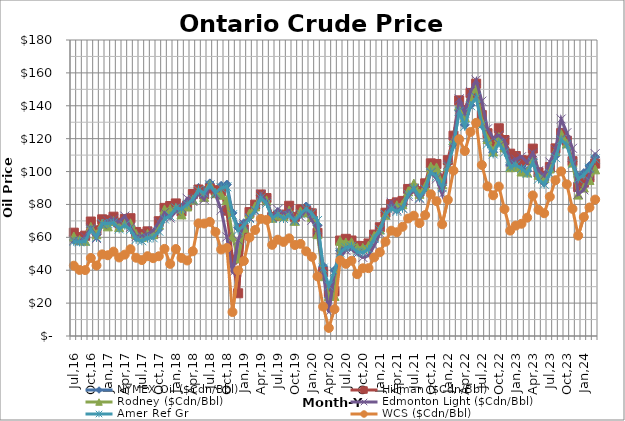
| Category | NYMEX Oil ($Cdn/Bbl) | Hillman ($Cdn/Bbl) | Rodney ($Cdn/Bbl) | Edmonton Light ($Cdn/Bbl) | Amer Ref Gr | WCS ($Cdn/Bbl) |
|---|---|---|---|---|---|---|
| Jul,16 | 58.402 | 62.836 | 60.504 | 58.2 | 57.457 | 42.76 |
| Aug,16 | 58.235 | 60.159 | 58.426 | 57.54 | 57.205 | 40.17 |
| Sep,16 | 59.2 | 61.012 | 57.906 | 60.34 | 57.582 | 40.081 |
| Oct,16 | 66.149 | 69.615 | 66.401 | 65.655 | 64.675 | 47.459 |
| Nov,16 | 61.53 | 64.262 | 61.841 | 59.252 | 59.938 | 42.876 |
| Dec,16 | 69.652 | 70.956 | 68.278 | 67.883 | 68.376 | 49.643 |
| Jan,17 | 69.463 | 70.426 | 66.674 | 70.263 | 68.355 | 49.105 |
| Feb,17 | 70.095 | 72.571 | 69.871 | 71.136 | 68.898 | 51.317 |
| Mar,17 | 66.475 | 68.879 | 66.254 | 69.358 | 65.124 | 47.748 |
| Apr,17 | 68.678 | 71.118 | 68.452 | 72.914 | 67.369 | 49.496 |
| May,17 | 65.993 | 71.625 | 68.537 | 66.034 | 64.689 | 52.805 |
| Jun,17 | 60.076 | 63.267 | 62.036 | 60.492 | 58.788 | 47.587 |
| Jul,17 | 59.257 | 62.109 | 60.273 | 60.781 | 57.919 | 46.174 |
| Aug,17 | 60.587 | 63.642 | 62.025 | 61.992 | 59.531 | 48.537 |
| Sep,17 | 61.304 | 61.944 | 62.001 | 64.05 | 59.71 | 47.33 |
| Oct,17 | 64.973 | 69.814 | 67.871 | 69.218 | 63.712 | 48.5 |
| Nov,17 | 72.302 | 77.915 | 77.01 | 74.995 | 71.177 | 52.97 |
| Dec,17 | 73.943 | 79.047 | 77.194 | 71.704 | 72.869 | 43.84 |
| Jan,18 | 79.159 | 80.619 | 77.818 | 75.84 | 77.86 | 52.89 |
| Feb,18 | 78.254 | 75.764 | 73.938 | 77.983 | 77.074 | 47.468 |
| Mar,18 | 81.145 | 79.266 | 78.768 | 83.738 | 80.07 | 45.931 |
| Apr,18 | 84.431 | 86.332 | 82.945 | 81.827 | 83.152 | 51.518 |
| May,18 | 90.071 | 89.084 | 87.869 | 86.469 | 88.661 | 68.515 |
| Jun,18 | 88.371 | 86.195 | 84.575 | 83.025 | 86.997 | 68.389 |
| Jul,18 | 92.834 | 89.682 | 92.103 | 91.69 | 91.853 | 69.403 |
| Aug,18 | 88.186 | 88.65 | 86.839 | 86.04 | 87.11 | 63.31 |
| Sep,18 | 91.353 | 88.011 | 85.875 | 76.584 | 90.048 | 52.619 |
| Oct,18 | 92.116 | 76.204 | 82.684 | 60.231 | 90.736 | 53.557 |
| Nov,18 | 74.857 | 46.458 | 60.539 | 38.18 | 73.748 | 14.564 |
| Dec,18 | 65.894 | 25.985 | 47.149 | 58.19 | 64.333 | 39.9 |
| Jan,19 | 68.598 | 64.901 | 65.838 | 68.237 | 67.176 | 45.643 |
| Feb,19 | 72.461 | 75.352 | 74.514 | 72.03 | 71.415 | 59.88 |
| Mar,19 | 77.576 | 79.881 | 78.823 | 75.883 | 76.31 | 64.45 |
| Apr,19 | 85.437 | 86.076 | 84.871 | 86.202 | 84 | 71.23 |
| May,19 | 82.033 | 83.896 | 82.476 | 81.878 | 80.625 | 70.59 |
| Jun,19 | 72.663 | 72.253 | 71.951 | 72.094 | 71.543 | 55.44 |
| Jul,19 | 75.396 | 73.099 | 73.39 | 76.928 | 74.025 | 58.565 |
| Aug,19 | 72.789 | 73.841 | 72.889 | 74.508 | 71.458 | 57.202 |
| Sep,19 | 75.039 | 79.193 | 76.376 | 76.28 | 73.259 | 59.38 |
| Oct,19 | 71.238 | 72.469 | 70.022 | 70.607 | 70.085 | 55.349 |
| Nov,19 | 75.548 | 77.039 | 75.838 | 72.429 | 74.247 | 56.023 |
| Dec,19 | 78.742 | 75.999 | 75.164 | 76.735 | 77.474 | 51.494 |
| Jan,20 | 75.252 | 74.589 | 72.465 | 70.37 | 74.533 | 48.163 |
| Feb,20 | 67.146 | 62.739 | 61.93 | 64.838 | 70.221 | 36.242 |
| Mar,20 | 42.432 | 38.954 | 36.347 | 38.976 | 41.26 | 17.895 |
| Apr,20 | 23.462 | 26.796 | 24.337 | 14.393 | 30.446 | 4.917 |
| May,20 | 39.854 | 27.179 | 24.275 | 39.091 | 39.303 | 16.304 |
| Jun,20 | 51.913 | 58.049 | 57.915 | 47.668 | 50.647 | 46.027 |
| Jul,20 | 55.042 | 59.093 | 56.879 | 52.082 | 53.684 | 43.881 |
| Aug,20 | 56.077 | 58.084 | 57.041 | 52.675 | 54.484 | 45.774 |
| Sep,20 | 52.389 | 54.812 | 53.729 | 49.964 | 51.075 | 37.588 |
| Oct,20 | 52.255 | 54.712 | 53.616 | 47.781 | 50.789 | 41.178 |
| Nov,20 | 54.044 | 56.287 | 54.964 | 48.849 | 52.646 | 41.265 |
| Dec,20 | 60.297 | 61.679 | 60.858 | 54.91 | 59.219 | 47.809 |
| Jan,21 | 66.282 | 66.14 | 64.731 | 62.481 | 64.632 | 50.937 |
| Feb,21 | 74.983 | 74.986 | 73.697 | 73.695 | 73.807 | 57.296 |
| Mar,21 | 78.398 | 80.183 | 79.152 | 81.291 | 77.519 | 64.043 |
| Apr,21 | 77.078 | 81.266 | 79.482 | 76.657 | 75.768 | 63.107 |
| May,21 | 78.982 | 82.158 | 80.117 | 77.794 | 77.656 | 66.403 |
| Jun,21 | 87.11 | 89.426 | 87.999 | 84.872 | 86.083 | 71.477 |
| Jul,21 | 90.665 | 89.672 | 92.712 | 89.013 | 89.898 | 73.177 |
| Aug,21 | 85.295 | 88.087 | 86.486 | 83.424 | 84.039 | 68.615 |
| Sep,21 | 90.668 | 92.849 | 90.944 | 88.762 | 89.205 | 73.528 |
| Oct,21 | 101.029 | 104.997 | 102.975 | 99.387 | 99.685 | 86.199 |
| Nov,21 | 98.848 | 104.62 | 102.506 | 95.57 | 96.887 | 82.003 |
| Dec,21 | 91.705 | 95.149 | 92.279 | 86.146 | 90.17 | 67.925 |
| Jan,22 | 104.783 | 106.942 | 103.137 | 104.341 | 103.147 | 82.838 |
| Feb,22 | 116.533 | 121.823 | 119.077 | 118.034 | 115.379 | 100.599 |
| Mar,22 | 136.984 | 143.301 | 140.302 | 144.221 | 136.624 | 119.659 |
| Apr,22 | 128.407 | 137.509 | 133.091 | 135.724 | 127.497 | 112.514 |
| May,22 | 140.345 | 147.804 | 145.005 | 148.645 | 140.063 | 124.083 |
| Jun,22 | 146.512 | 153.443 | 151.004 | 155.63 | 144.967 | 129.637 |
| Jul,22 | 128.506 | 134.332 | 130.35 | 142.826 | 128.197 | 104.01 |
| Aug,22 | 118.207 | 123.306 | 119.807 | 125.977 | 116.828 | 91.03 |
| Sep,22 | 111.713 | 118.064 | 112.183 | 120.409 | 110.719 | 85.556 |
| Oct,22 | 119.161 | 126.324 | 120.968 | 122.031 | 117.4 | 90.886 |
| Nov,22 | 113.38 | 119.187 | 114.732 | 118.721 | 111.783 | 77.176 |
| Dec,22 | 104.014 | 110.88 | 102.642 | 105.981 | 102.846 | 64.093 |
| Jan,23 | 104.923 | 109.431 | 102.838 | 107.56 | 104.002 | 67.147 |
| Feb,23 | 103.377 | 106.894 | 100.032 | 109.019 | 101.849 | 68.247 |
| Mar,23 | 100.383 | 106.738 | 99.506 | 105.574 | 98.913 | 71.954 |
| Apr,23 | 107.196 | 113.956 | 108.124 | 111.394 | 105.491 | 85.484 |
| May,23 | 96.812 | 99.56 | 98.021 | 100.486 | 95.432 | 76.729 |
| Jun,23 | 93.352 | 97.351 | 96.232 | 97.44 | 92.248 | 74.651 |
| Jul,23 | 100.491 | 102.724 | 101.86 | 105.795 | 98.679 | 84.72 |
| Aug,23 | 109.617 | 114.102 | 112.598 | 113.403 | 108.431 | 94.748 |
| Sep,23 | 121.108 | 123.413 | 122.809 | 131.948 | 119.293 | 100.105 |
| Oct,23 | 117.182 | 118.772 | 117.133 | 123.609 | 116.305 | 92.234 |
| Nov,23 | 106.061 | 106.329 | 105.434 | 114.137 | 104.644 | 77.318 |
| Dec,23 | 96.723 | 90.648 | 85.974 | 86.273 | 95.56 | 61.038 |
| Jan,24 | 99.078 | 93.268 | 90.268 | 88.851 | 97.8 | 72.33 |
| Feb,24 | 103.409 | 96.424 | 94.836 | 97.825 | 102.022 | 78.15 |
| Mar,24 | 108.833 | 104.795 | 101.332 | 110.861 | 107.673 | 82.953 |